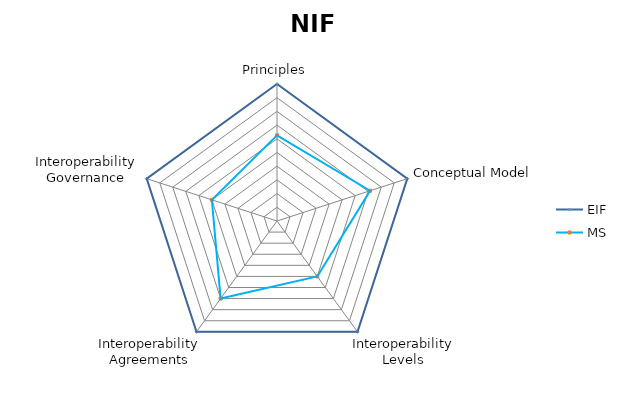
| Category | EIF | MS |
|---|---|---|
| Principles | 1 | 0.625 |
| Conceptual Model | 1 | 0.714 |
| Interoperability Levels | 1 | 0.5 |
| Interoperability Agreements | 1 | 0.7 |
| Interoperability Governance | 1 | 0.5 |